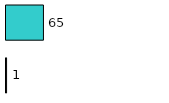
| Category | Series 0 | Series 1 |
|---|---|---|
| 0 | 1 | 65 |